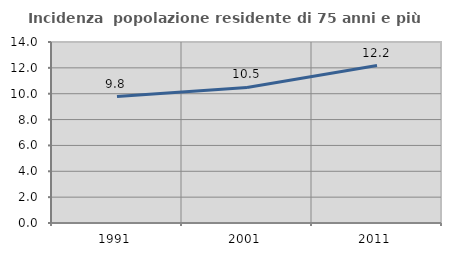
| Category | Incidenza  popolazione residente di 75 anni e più |
|---|---|
| 1991.0 | 9.78 |
| 2001.0 | 10.485 |
| 2011.0 | 12.179 |